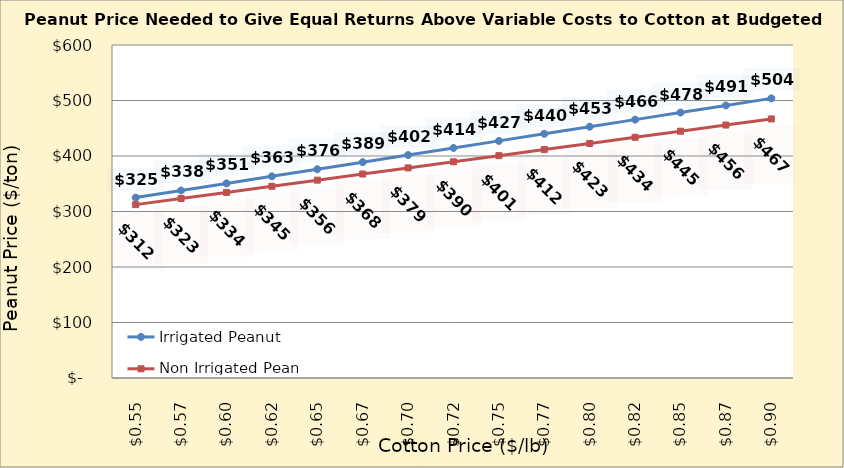
| Category | Irrigated Peanut | Non Irrigated Peanut |
|---|---|---|
| 0.5449999999999998 | 325.094 | 312.365 |
| 0.5699999999999998 | 337.86 | 323.395 |
| 0.5949999999999999 | 350.626 | 334.424 |
| 0.6199999999999999 | 363.392 | 345.454 |
| 0.6449999999999999 | 376.158 | 356.483 |
| 0.6699999999999999 | 388.924 | 367.512 |
| 0.695 | 401.69 | 378.542 |
| 0.72 | 414.456 | 389.571 |
| 0.745 | 427.222 | 400.601 |
| 0.77 | 439.987 | 411.63 |
| 0.795 | 452.753 | 422.66 |
| 0.8200000000000001 | 465.519 | 433.689 |
| 0.8450000000000001 | 478.285 | 444.718 |
| 0.8700000000000001 | 491.051 | 455.748 |
| 0.8950000000000001 | 503.817 | 466.777 |